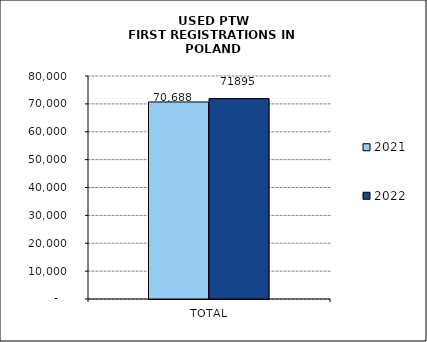
| Category | 2021 | 2022 |
|---|---|---|
| TOTAL | 70688 | 71895 |